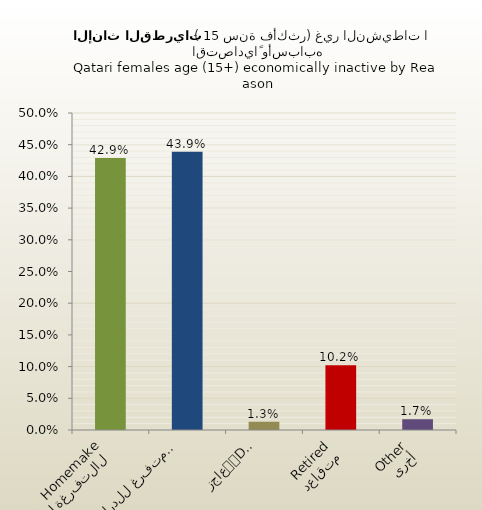
| Category | الاناث القطريات |
|---|---|
| التفرغة لأعمال المنزل
Homemaker | 0.429 |
| متفرغ للدراسة
Student | 0.439 |
| عاجز
Disabled | 0.013 |
| متقاعد
Retired | 0.102 |
| أخرى
Other | 0.017 |